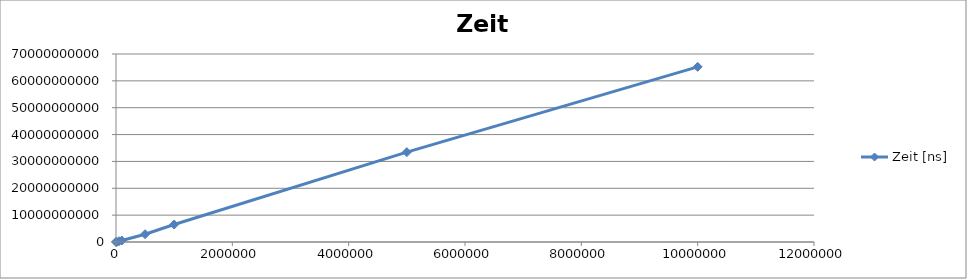
| Category | Zeit [ns] |
|---|---|
| 1000.0 | 7756672 |
| 5000.0 | 29428583 |
| 10000.0 | 58108328 |
| 50000.0 | 282544153 |
| 100000.0 | 551178199 |
| 500000.0 | 2908341006 |
| 1000000.0 | 6509268273 |
| 5000000.0 | 33454613464 |
| 10000000.0 | 65220220641 |